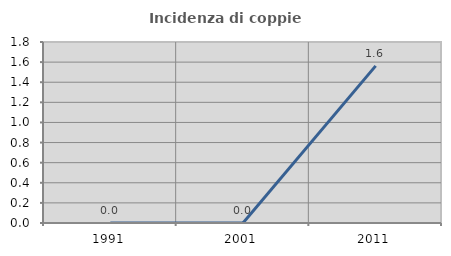
| Category | Incidenza di coppie miste |
|---|---|
| 1991.0 | 0 |
| 2001.0 | 0 |
| 2011.0 | 1.562 |